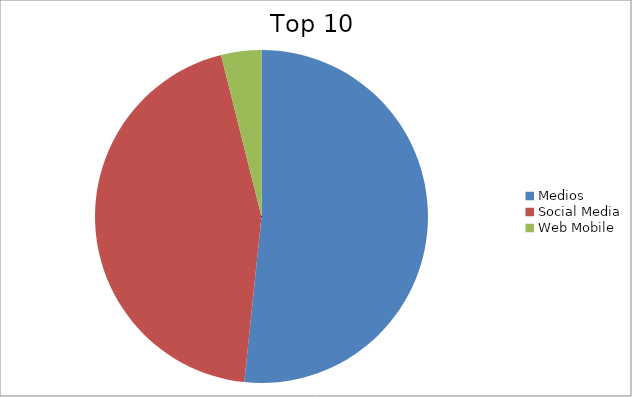
| Category | Series 0 |
|---|---|
| Medios | 51.65 |
| Social Media | 44.44 |
| Web Mobile | 3.91 |